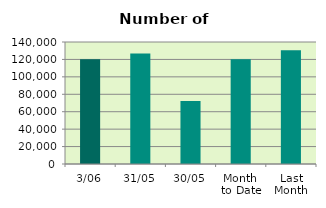
| Category | Series 0 |
|---|---|
| 3/06 | 120294 |
| 31/05 | 126870 |
| 30/05 | 72230 |
| Month 
to Date | 120294 |
| Last
Month | 130647.636 |